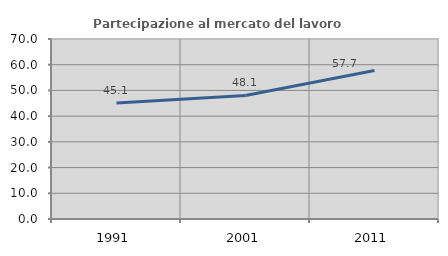
| Category | Partecipazione al mercato del lavoro  femminile |
|---|---|
| 1991.0 | 45.144 |
| 2001.0 | 48.062 |
| 2011.0 | 57.728 |